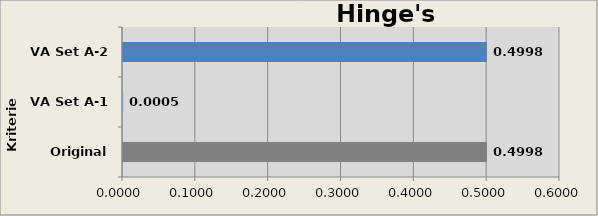
| Category | Hinge's Construction |
|---|---|
| Original A-0 | 0.5 |
| VA Set A-1 | 0 |
| VA Set A-2 | 0.5 |